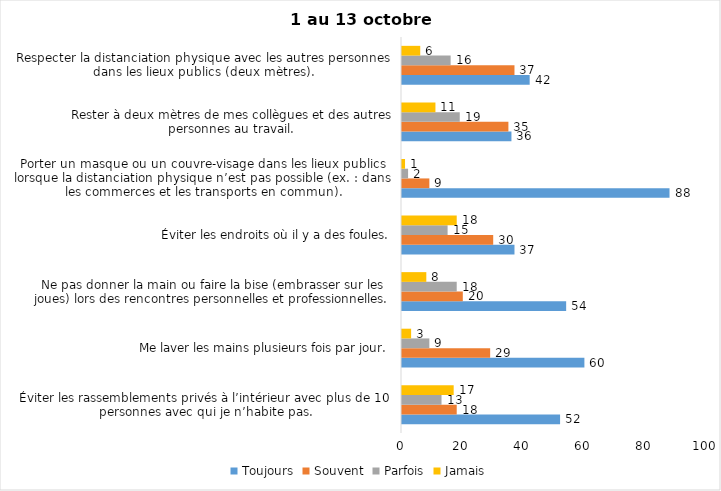
| Category | Toujours | Souvent | Parfois | Jamais |
|---|---|---|---|---|
| Éviter les rassemblements privés à l’intérieur avec plus de 10 personnes avec qui je n’habite pas. | 52 | 18 | 13 | 17 |
| Me laver les mains plusieurs fois par jour. | 60 | 29 | 9 | 3 |
| Ne pas donner la main ou faire la bise (embrasser sur les joues) lors des rencontres personnelles et professionnelles. | 54 | 20 | 18 | 8 |
| Éviter les endroits où il y a des foules. | 37 | 30 | 15 | 18 |
| Porter un masque ou un couvre-visage dans les lieux publics lorsque la distanciation physique n’est pas possible (ex. : dans les commerces et les transports en commun). | 88 | 9 | 2 | 1 |
| Rester à deux mètres de mes collègues et des autres personnes au travail. | 36 | 35 | 19 | 11 |
| Respecter la distanciation physique avec les autres personnes dans les lieux publics (deux mètres). | 42 | 37 | 16 | 6 |